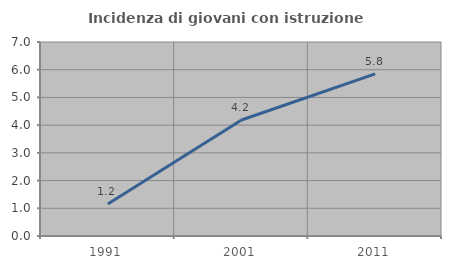
| Category | Incidenza di giovani con istruzione universitaria |
|---|---|
| 1991.0 | 1.156 |
| 2001.0 | 4.186 |
| 2011.0 | 5.848 |